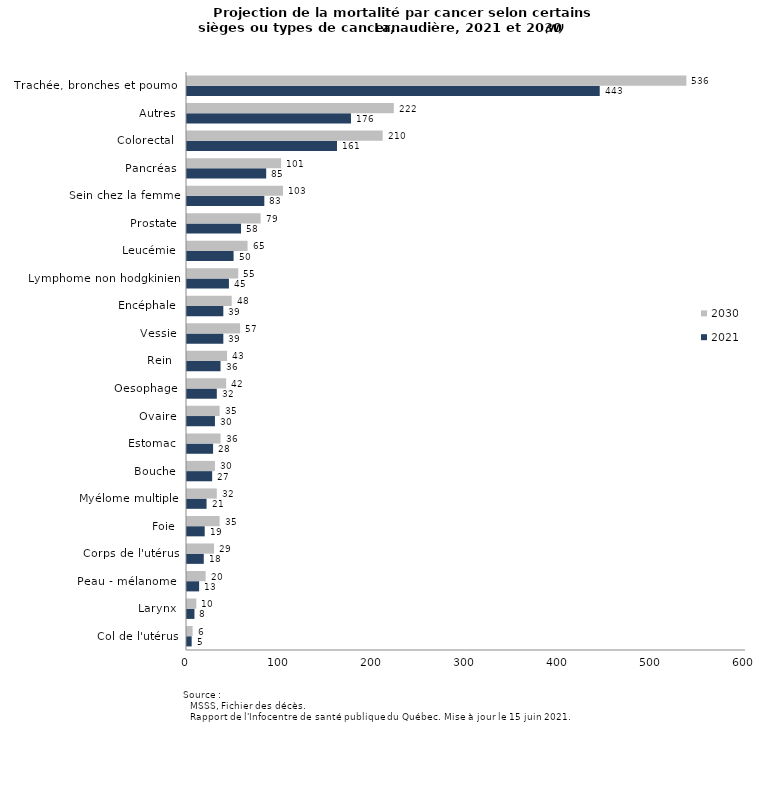
| Category | 2021 | 2030 |
|---|---|---|
| Col de l'utérus | 5 | 6 |
| Larynx | 8 | 10 |
| Peau - mélanome  | 13 | 20 |
| Corps de l'utérus | 18 | 29 |
| Foie | 19 | 35 |
| Myélome multiple | 21 | 32 |
| Bouche | 27 | 30 |
| Estomac | 28 | 36 |
| Ovaire | 30 | 35 |
| Oesophage | 32 | 42 |
| Rein  | 36 | 43 |
| Vessie | 39 | 57 |
| Encéphale | 39 | 48 |
| Lymphome non hodgkinien | 45 | 55 |
| Leucémie | 50 | 65 |
| Prostate | 58 | 79 |
| Sein chez la femme | 83 | 103 |
| Pancréas | 85 | 101 |
| Colorectal  | 161 | 210 |
| Autres | 176 | 222 |
| Trachée, bronches et poumon | 443 | 536 |